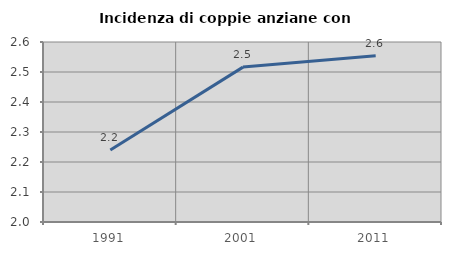
| Category | Incidenza di coppie anziane con figli |
|---|---|
| 1991.0 | 2.24 |
| 2001.0 | 2.516 |
| 2011.0 | 2.554 |